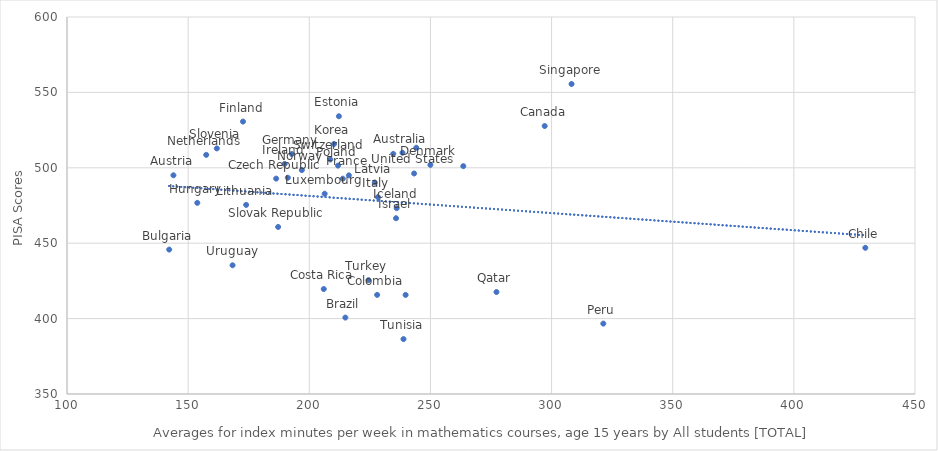
| Category | Series 0 |
|---|---|
| 238.453709569167 | 509.994 |
| 143.926262681045 | 495.037 |
| 214.891463960586 | 400.682 |
| 142.185841968444 | 445.772 |
| 297.16081885735 | 527.705 |
| 429.505059641692 | 446.956 |
| 228.00669738556 | 415.729 |
| 205.977848045057 | 419.608 |
| 186.325473038649 | 492.83 |
| 249.981500642479 | 501.937 |
| 212.222161832157 | 534.194 |
| 172.633192201217 | 530.661 |
| 216.334368181391 | 494.978 |
| 192.796607845638 | 509.141 |
| 153.776284989669 | 476.748 |
| 236.061808418602 | 473.23 |
| 189.851776256293 | 502.575 |
| 235.805019405674 | 466.553 |
| 228.348636290313 | 480.547 |
| 210.189470241199 | 515.81 |
| 227.019070942819 | 490.225 |
| 173.941397969109 | 475.409 |
| 206.345910117092 | 482.806 |
| 239.756877489971 | 415.71 |
| 157.462496439803 | 508.575 |
| 244.152880508377 | 513.304 |
| 196.932247041093 | 498.481 |
| 321.354570860455 | 396.684 |
| 211.852859325365 | 501.435 |
| 263.566609152089 | 501.1 |
| 277.257145299163 | 417.611 |
| 308.241919150359 | 555.575 |
| 187.140677743997 | 460.775 |
| 161.843651104069 | 512.864 |
| 213.821606030511 | 492.786 |
| 191.152520102144 | 493.422 |
| 208.680395223927 | 505.506 |
| 238.880749581829 | 386.403 |
| 224.435171639864 | 425.49 |
| 234.639201900479 | 509.222 |
| 243.271502755966 | 496.242 |
| 168.331190340717 | 435.363 |